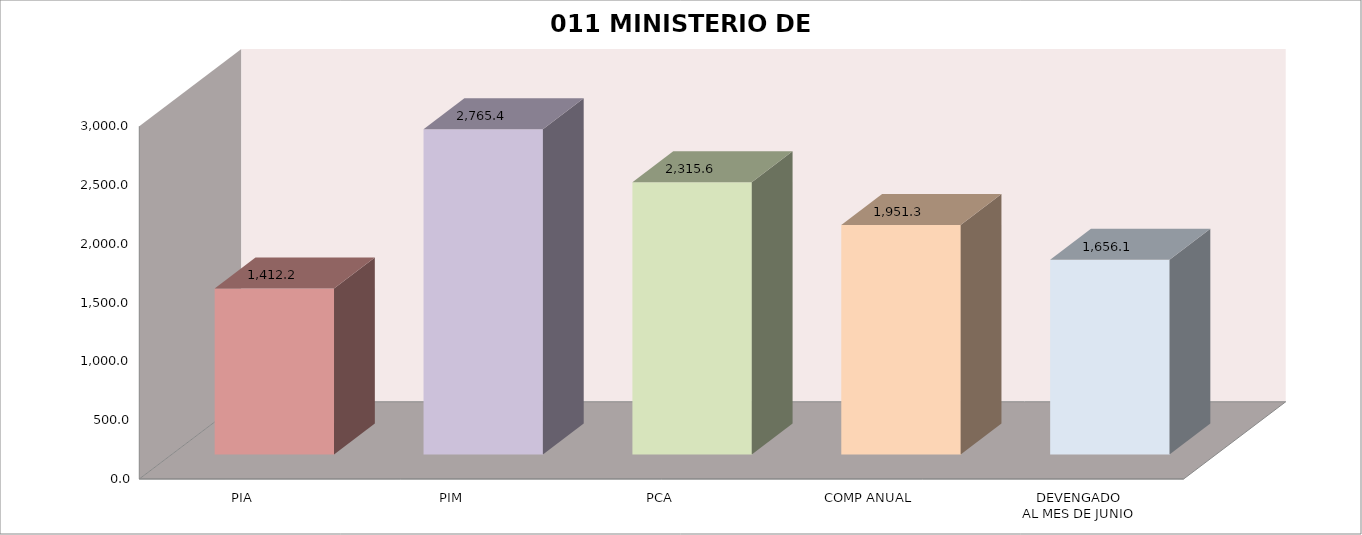
| Category | 011 MINISTERIO DE SALUD |
|---|---|
| PIA | 1412.218 |
| PIM | 2765.408 |
| PCA | 2315.552 |
| COMP ANUAL | 1951.262 |
| DEVENGADO
AL MES DE JUNIO | 1656.131 |